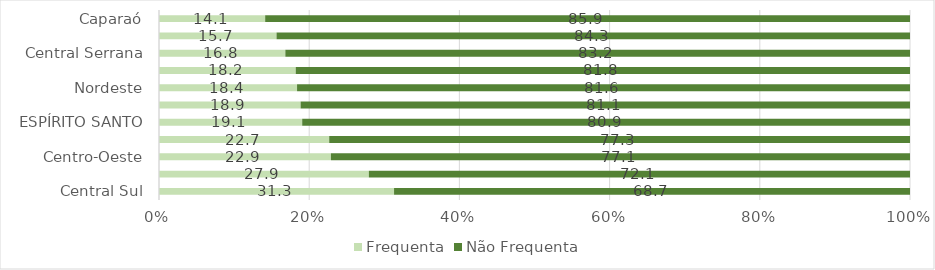
| Category | Frequenta | Não Frequenta |
|---|---|---|
| Central Sul | 31.3 | 68.7 |
| Litoral Sul | 27.945 | 72.055 |
| Centro-Oeste | 22.891 | 77.109 |
| Rio Doce | 22.665 | 77.335 |
| ESPÍRITO SANTO | 19.069 | 80.931 |
| Sudoeste Serrana | 18.858 | 81.142 |
| Nordeste | 18.383 | 81.617 |
| Noroeste | 18.208 | 81.792 |
| Central Serrana | 16.824 | 83.176 |
| Metropolitana | 15.652 | 84.348 |
| Caparaó | 14.138 | 85.862 |